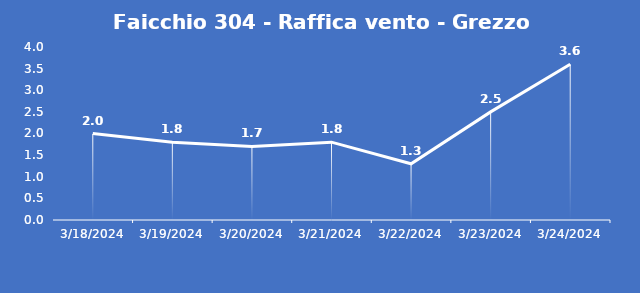
| Category | Faicchio 304 - Raffica vento - Grezzo (m/s) |
|---|---|
| 3/18/24 | 2 |
| 3/19/24 | 1.8 |
| 3/20/24 | 1.7 |
| 3/21/24 | 1.8 |
| 3/22/24 | 1.3 |
| 3/23/24 | 2.5 |
| 3/24/24 | 3.6 |